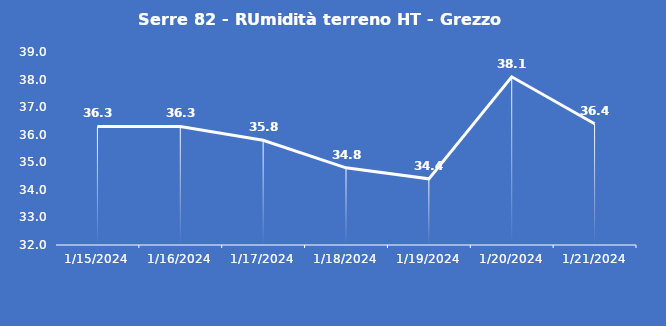
| Category | Serre 82 - RUmidità terreno HT - Grezzo (%VWC) |
|---|---|
| 1/15/24 | 36.3 |
| 1/16/24 | 36.3 |
| 1/17/24 | 35.8 |
| 1/18/24 | 34.8 |
| 1/19/24 | 34.4 |
| 1/20/24 | 38.1 |
| 1/21/24 | 36.4 |